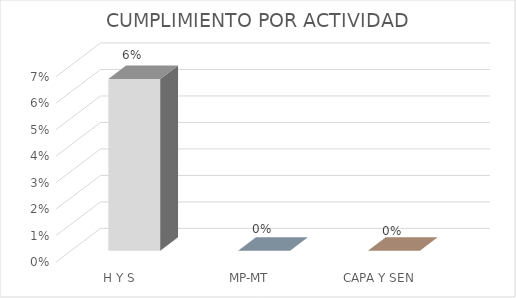
| Category | Cumplimiento |
|---|---|
| H Y S | 0.065 |
| MP-MT | 0 |
| CAPA Y SEN | 0 |